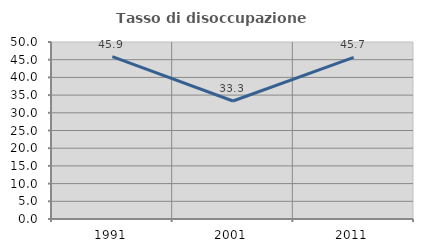
| Category | Tasso di disoccupazione giovanile  |
|---|---|
| 1991.0 | 45.86 |
| 2001.0 | 33.333 |
| 2011.0 | 45.652 |